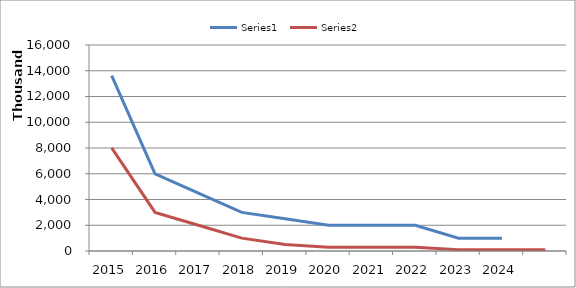
| Category | Series 0 | Series 1 |
|---|---|---|
| 2015.0 | 13621000 | 8008000 |
| 2016.0 | 6000000 | 3000000 |
| 2017.0 | 4500000 | 2000000 |
| 2018.0 | 3000000 | 1000000 |
| 2019.0 | 2500000 | 500000 |
| 2020.0 | 2000000 | 300000 |
| 2021.0 | 2000000 | 300000 |
| 2022.0 | 2000000 | 300000 |
| 2023.0 | 1000000 | 100000 |
| 2024.0 | 1000000 | 100000 |